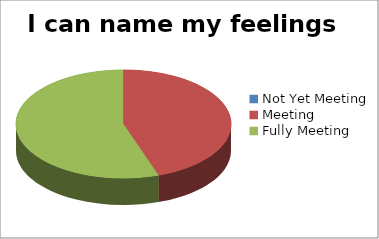
| Category | I can name my feelings |
|---|---|
| Not Yet Meeting | 0 |
| Meeting | 17 |
| Fully Meeting | 21 |